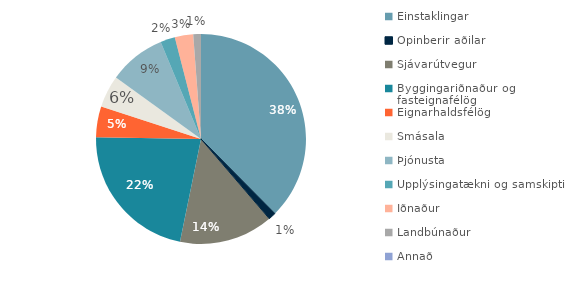
| Category | Series 0 |
|---|---|
| Einstaklingar | 320690 |
| Opinberir aðilar | 9783 |
| Sjávarútvegur | 123626 |
| Byggingariðnaður og fasteignafélög | 188327 |
| Eignarhaldsfélög | 40490 |
| Smásala | 42235 |
| Þjónusta | 74743 |
| Upplýsingatækni og samskipti | 19220 |
| Iðnaður | 24167 |
| Landbúnaður | 10135 |
| Annað | 1 |